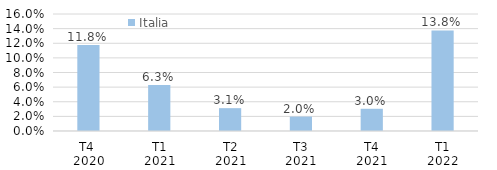
| Category | Italia |
|---|---|
| T4 
2020 | 0.118 |
| T1
2021 | 0.063 |
| T2
2021 | 0.031 |
| T3
2021 | 0.02 |
| T4
2021 | 0.03 |
| T1
2022 | 0.138 |